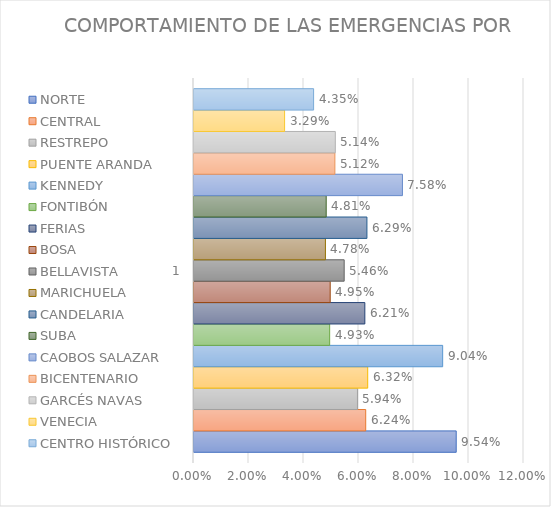
| Category | NORTE | CENTRAL | RESTREPO | PUENTE ARANDA | KENNEDY | FONTIBÓN | FERIAS | BOSA | BELLAVISTA | MARICHUELA | CANDELARIA | SUBA | CAOBOS SALAZAR | BICENTENARIO | GARCÉS NAVAS | VENECIA | CENTRO HISTÓRICO |
|---|---|---|---|---|---|---|---|---|---|---|---|---|---|---|---|---|---|
| 0 | 0.095 | 0.062 | 0.059 | 0.063 | 0.09 | 0.049 | 0.062 | 0.05 | 0.055 | 0.048 | 0.063 | 0.048 | 0.076 | 0.051 | 0.051 | 0.033 | 0.043 |